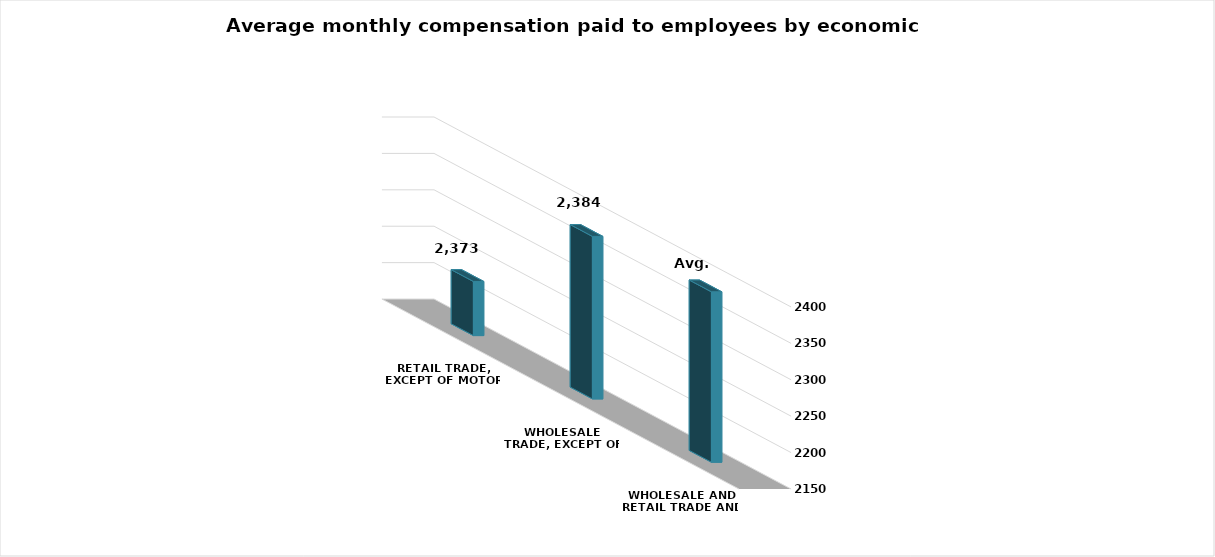
| Category | متوسط التعويضات  |
|---|---|
| Wholesale and retail trade and repair of motor vehicles and motorcycles | 2384.026 |
| Wholesale trade, except of motor vehicles and motorcycles | 2373.197 |
| Retail trade, except of motor vehicles and motorcycles | 2224.359 |